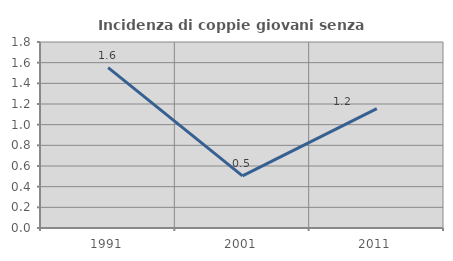
| Category | Incidenza di coppie giovani senza figli |
|---|---|
| 1991.0 | 1.552 |
| 2001.0 | 0.504 |
| 2011.0 | 1.156 |